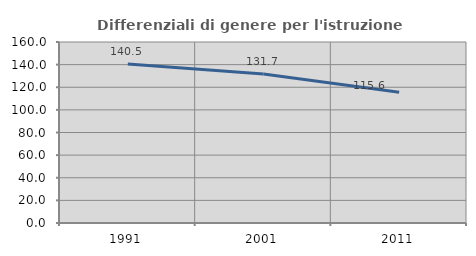
| Category | Differenziali di genere per l'istruzione superiore |
|---|---|
| 1991.0 | 140.528 |
| 2001.0 | 131.678 |
| 2011.0 | 115.649 |